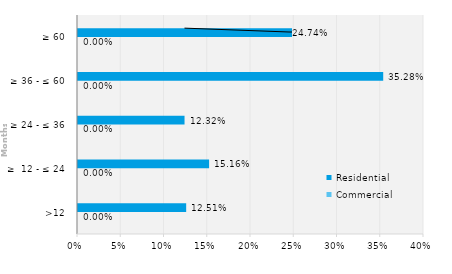
| Category | Commercial | Residential |
|---|---|---|
| >12 | 0 | 0.125 |
| ≥  12 - ≤ 24 | 0 | 0.152 |
| ≥ 24 - ≤ 36 | 0 | 0.123 |
| ≥ 36 - ≤ 60 | 0 | 0.353 |
| ≥ 60 | 0 | 0.247 |